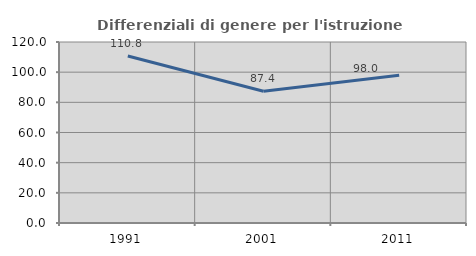
| Category | Differenziali di genere per l'istruzione superiore |
|---|---|
| 1991.0 | 110.762 |
| 2001.0 | 87.396 |
| 2011.0 | 98.002 |